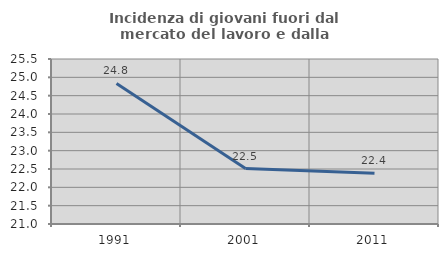
| Category | Incidenza di giovani fuori dal mercato del lavoro e dalla formazione  |
|---|---|
| 1991.0 | 24.835 |
| 2001.0 | 22.513 |
| 2011.0 | 22.383 |